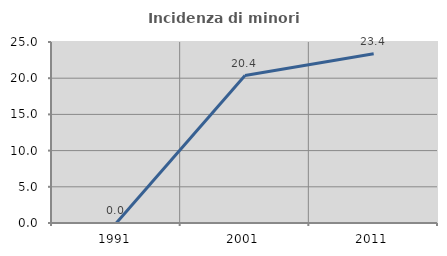
| Category | Incidenza di minori stranieri |
|---|---|
| 1991.0 | 0 |
| 2001.0 | 20.37 |
| 2011.0 | 23.37 |